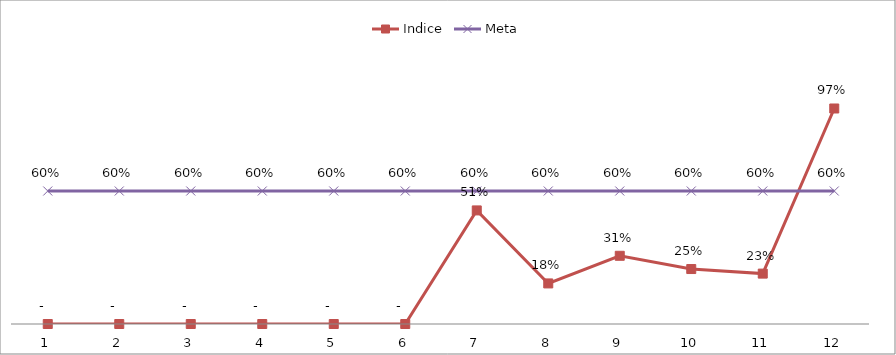
| Category | Indice | Meta |
|---|---|---|
| 0 | 0 | 0.6 |
| 1 | 0 | 0.6 |
| 2 | 0 | 0.6 |
| 3 | 0 | 0.6 |
| 4 | 0 | 0.6 |
| 5 | 0 | 0.6 |
| 6 | 0.512 | 0.6 |
| 7 | 0.183 | 0.6 |
| 8 | 0.308 | 0.6 |
| 9 | 0.248 | 0.6 |
| 10 | 0.227 | 0.6 |
| 11 | 0.972 | 0.6 |